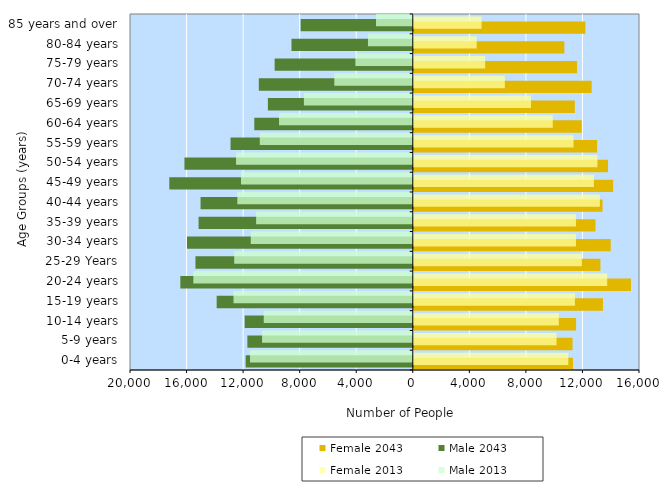
| Category | Female 2043 | Male 2043 | Female 2013 | Male 2013 |
|---|---|---|---|---|
|   0-4 years | 11260 | -11820 | 10930 | -11510 |
|   5-9 years | 11230 | -11700 | 10100 | -10660 |
|   10-14 years | 11480 | -11890 | 10260 | -10540 |
|   15-19 years | 13380 | -13870 | 11400 | -12680 |
|   20-24 years | 15360 | -16440 | 13680 | -15520 |
|   25-29 Years | 13200 | -15370 | 11890 | -12630 |
|   30-34 years | 13930 | -15970 | 11470 | -11460 |
|   35-39 years | 12850 | -15150 | 11470 | -11080 |
|   40-44 years | 13350 | -15010 | 13160 | -12410 |
|   45-49 years | 14100 | -17220 | 12740 | -12150 |
|   50-54 years | 13740 | -16150 | 12990 | -12500 |
|   55-59 years | 12970 | -12890 | 11300 | -10820 |
|   60-64 years | 11880 | -11210 | 9830 | -9460 |
|   65-69 years | 11390 | -10250 | 8290 | -7700 |
|   70-74 years | 12580 | -10890 | 6440 | -5550 |
|   75-79 years | 11550 | -9770 | 5050 | -4060 |
|   80-84 years | 10650 | -8580 | 4450 | -3170 |
|   85 years and over | 12140 | -7930 | 4800 | -2600 |